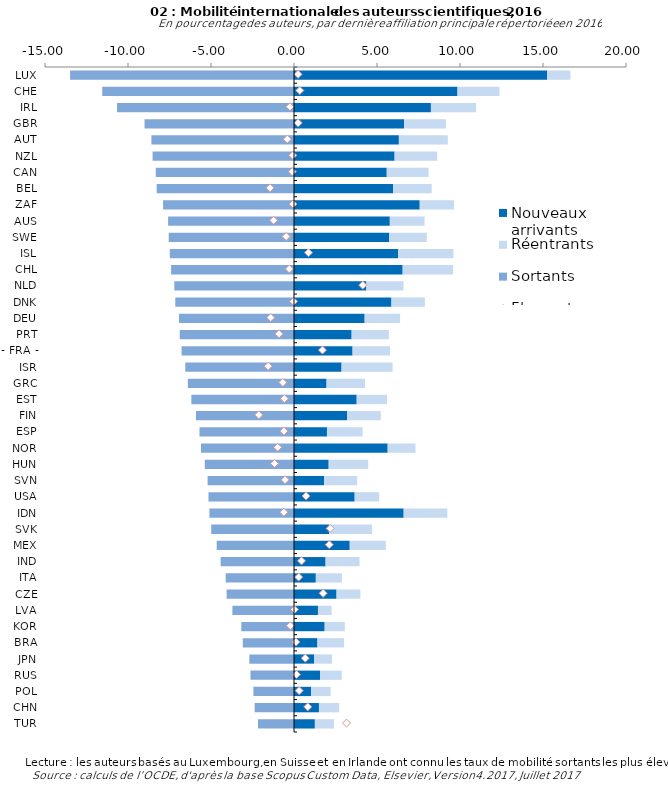
| Category | Nouveaux arrivants | Réentrants | Sortants |
|---|---|---|---|
| LUX | 15.256 | 1.395 | -13.488 |
| CHE | 9.85 | 2.528 | -11.551 |
| IRL | 8.249 | 2.72 | -10.659 |
| GBR | 6.626 | 2.528 | -9.003 |
| AUT | 6.318 | 2.95 | -8.589 |
| NZL | 6.061 | 2.566 | -8.518 |
| CAN | 5.587 | 2.518 | -8.328 |
| BEL | 5.973 | 2.324 | -8.271 |
| ZAF | 7.575 | 2.067 | -7.887 |
| AUS | 5.773 | 2.091 | -7.584 |
| SWE | 5.737 | 2.262 | -7.546 |
| ISL | 6.269 | 3.337 | -7.482 |
| CHL | 6.546 | 3.035 | -7.403 |
| NLD | 4.357 | 2.239 | -7.21 |
| DNK | 5.871 | 2.01 | -7.151 |
| DEU | 4.257 | 2.133 | -6.928 |
| PRT | 3.472 | 2.243 | -6.883 |
| - FRA - | 3.529 | 2.262 | -6.772 |
| ISR | 2.866 | 3.072 | -6.55 |
| GRC | 1.962 | 2.313 | -6.397 |
| EST | 3.776 | 1.826 | -6.183 |
| FIN | 3.201 | 2.03 | -5.904 |
| ESP | 1.985 | 2.15 | -5.693 |
| NOR | 5.643 | 1.675 | -5.602 |
| HUN | 2.089 | 2.383 | -5.375 |
| SVN | 1.82 | 1.984 | -5.204 |
| USA | 3.656 | 1.473 | -5.152 |
| IDN | 6.607 | 2.627 | -5.095 |
| SVK | 2.107 | 2.599 | -4.988 |
| MEX | 3.358 | 2.173 | -4.656 |
| IND | 1.904 | 2.042 | -4.42 |
| ITA | 1.315 | 1.569 | -4.115 |
| CZE | 2.563 | 1.435 | -4.06 |
| LVA | 1.443 | 0.825 | -3.711 |
| KOR | 1.847 | 1.216 | -3.175 |
| BRA | 1.413 | 1.603 | -3.086 |
| JPN | 1.22 | 1.069 | -2.691 |
| RUS | 1.577 | 1.298 | -2.621 |
| POL | 1.031 | 1.174 | -2.446 |
| CHN | 1.503 | 1.219 | -2.371 |
| TUR | 1.257 | 1.156 | -2.169 |